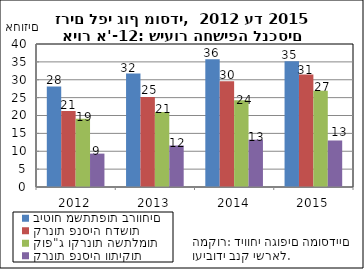
| Category | ביטוח משתתפות ברווחים | קרנות פנסיה חדשות | קופ"ג וקרנות השתלמות | קרנות פנסיה וותיקות |
|---|---|---|---|---|
| 0 | 28.147 | 21.244 | 19.121 | 9.337 |
| 1900-01-01 | 31.723 | 25.147 | 20.998 | 11.611 |
| 1900-01-02 | 35.736 | 29.549 | 24.291 | 13.244 |
| 1900-01-03 | 35.167 | 31.474 | 26.931 | 13.011 |